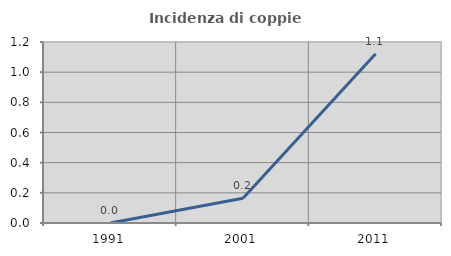
| Category | Incidenza di coppie miste |
|---|---|
| 1991.0 | 0 |
| 2001.0 | 0.164 |
| 2011.0 | 1.121 |